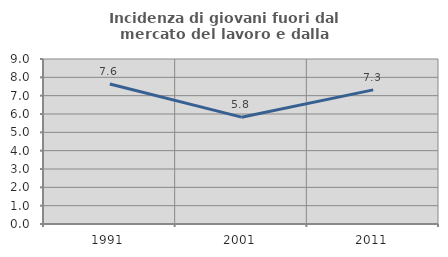
| Category | Incidenza di giovani fuori dal mercato del lavoro e dalla formazione  |
|---|---|
| 1991.0 | 7.632 |
| 2001.0 | 5.828 |
| 2011.0 | 7.317 |